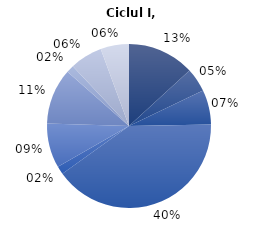
| Category | 2021/22 |
|---|---|
| 0 | 13.2 |
| 1 | 4.7 |
| 2 | 6.8 |
| 3 | 40.4 |
| 4 | 1.6 |
| 5 | 8.8 |
| 6 | 11 |
| 7 | 1.5 |
| 8 | 6.4 |
| 9 | 5.6 |